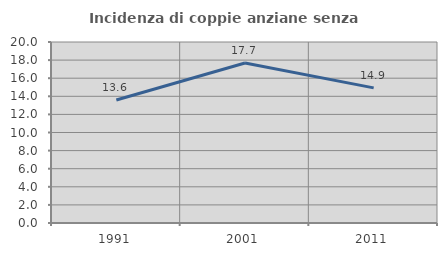
| Category | Incidenza di coppie anziane senza figli  |
|---|---|
| 1991.0 | 13.598 |
| 2001.0 | 17.68 |
| 2011.0 | 14.933 |